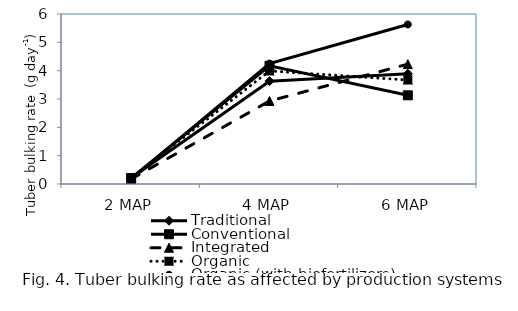
| Category | Traditional | Conventional | Integrated | Organic  | Organic (with biofertilizers) |
|---|---|---|---|---|---|
| 2 MAP | 0.21 | 0.209 | 0.175 | 0.215 | 0.177 |
| 4 MAP | 3.63 | 4.17 | 2.93 | 3.99 | 4.25 |
| 6 MAP | 3.89 | 3.13 | 4.23 | 3.67 | 5.63 |